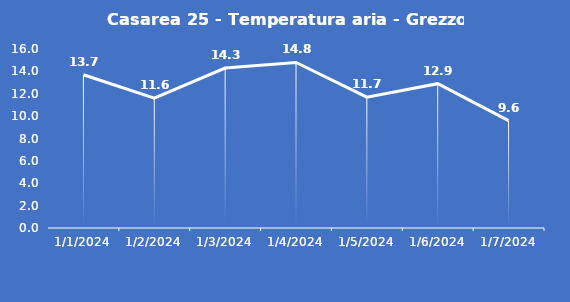
| Category | Casarea 25 - Temperatura aria - Grezzo (°C) |
|---|---|
| 1/1/24 | 13.7 |
| 1/2/24 | 11.6 |
| 1/3/24 | 14.3 |
| 1/4/24 | 14.8 |
| 1/5/24 | 11.7 |
| 1/6/24 | 12.9 |
| 1/7/24 | 9.6 |